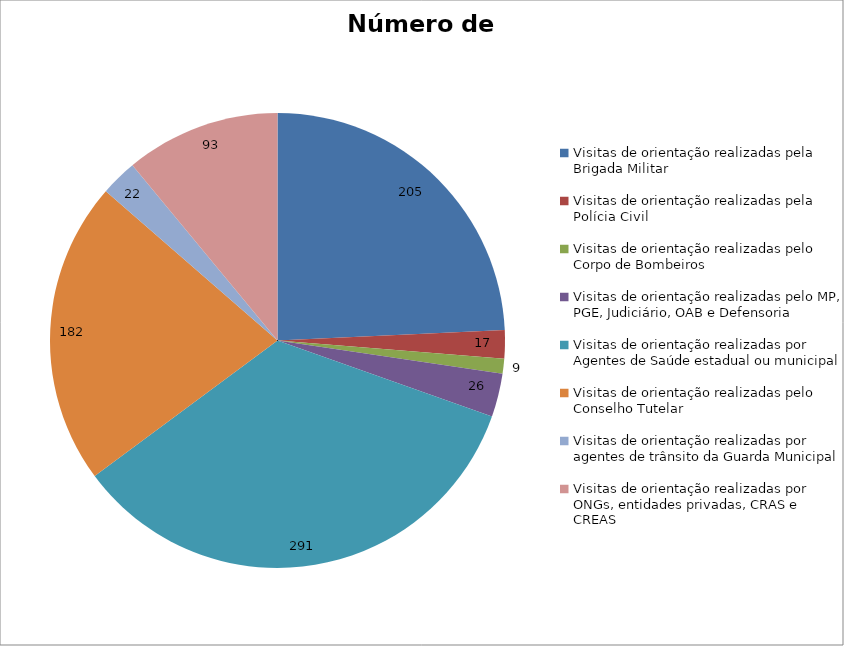
| Category | Número de Ações |
|---|---|
| Visitas de orientação realizadas pela Brigada Militar | 205 |
| Visitas de orientação realizadas pela Polícia Civil | 17 |
| Visitas de orientação realizadas pelo Corpo de Bombeiros | 9 |
| Visitas de orientação realizadas pelo MP, PGE, Judiciário, OAB e Defensoria | 26 |
| Visitas de orientação realizadas por Agentes de Saúde estadual ou municipal | 291 |
| Visitas de orientação realizadas pelo Conselho Tutelar | 182 |
| Visitas de orientação realizadas por agentes de trânsito da Guarda Municipal | 22 |
| Visitas de orientação realizadas por ONGs, entidades privadas, CRAS e CREAS | 93 |